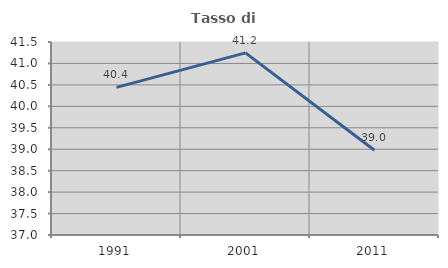
| Category | Tasso di occupazione   |
|---|---|
| 1991.0 | 40.443 |
| 2001.0 | 41.246 |
| 2011.0 | 38.978 |